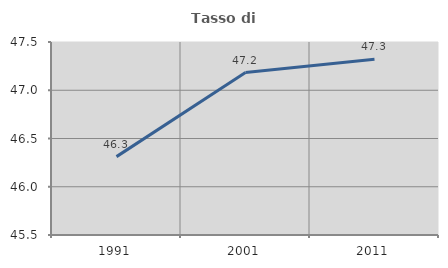
| Category | Tasso di occupazione   |
|---|---|
| 1991.0 | 46.312 |
| 2001.0 | 47.183 |
| 2011.0 | 47.321 |